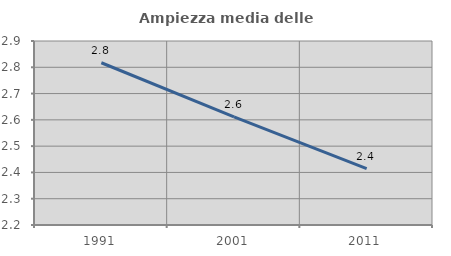
| Category | Ampiezza media delle famiglie |
|---|---|
| 1991.0 | 2.817 |
| 2001.0 | 2.612 |
| 2011.0 | 2.415 |